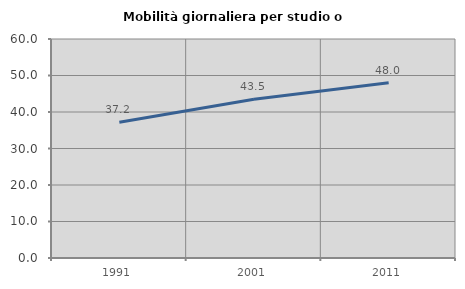
| Category | Mobilità giornaliera per studio o lavoro |
|---|---|
| 1991.0 | 37.182 |
| 2001.0 | 43.468 |
| 2011.0 | 48.045 |